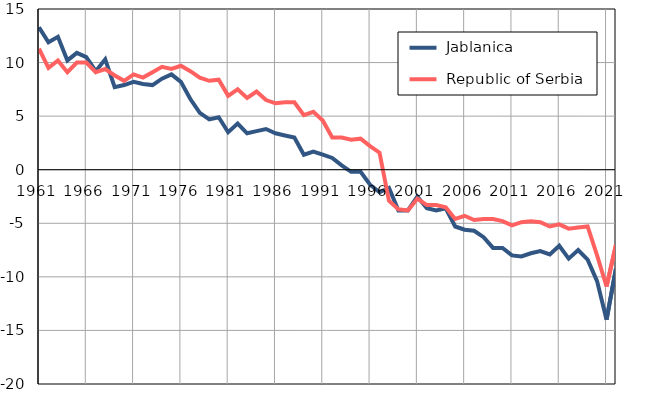
| Category |  Jablanica |  Republic of Serbia |
|---|---|---|
| 1961.0 | 13.3 | 11.3 |
| 1962.0 | 11.9 | 9.5 |
| 1963.0 | 12.4 | 10.2 |
| 1964.0 | 10.2 | 9.1 |
| 1965.0 | 10.9 | 10 |
| 1966.0 | 10.5 | 10 |
| 1967.0 | 9.2 | 9.1 |
| 1968.0 | 10.3 | 9.4 |
| 1969.0 | 7.7 | 8.8 |
| 1970.0 | 7.9 | 8.3 |
| 1971.0 | 8.2 | 8.9 |
| 1972.0 | 8 | 8.6 |
| 1973.0 | 7.9 | 9.1 |
| 1974.0 | 8.5 | 9.6 |
| 1975.0 | 8.9 | 9.4 |
| 1976.0 | 8.2 | 9.7 |
| 1977.0 | 6.6 | 9.2 |
| 1978.0 | 5.3 | 8.6 |
| 1979.0 | 4.7 | 8.3 |
| 1980.0 | 4.9 | 8.4 |
| 1981.0 | 3.5 | 6.9 |
| 1982.0 | 4.3 | 7.5 |
| 1983.0 | 3.4 | 6.7 |
| 1984.0 | 3.6 | 7.3 |
| 1985.0 | 3.8 | 6.5 |
| 1986.0 | 3.4 | 6.2 |
| 1987.0 | 3.2 | 6.3 |
| 1988.0 | 3 | 6.3 |
| 1989.0 | 1.4 | 5.1 |
| 1990.0 | 1.7 | 5.4 |
| 1991.0 | 1.4 | 4.6 |
| 1992.0 | 1.1 | 3 |
| 1993.0 | 0.4 | 3 |
| 1994.0 | -0.2 | 2.8 |
| 1995.0 | -0.2 | 2.9 |
| 1996.0 | -1.4 | 2.2 |
| 1997.0 | -2.1 | 1.6 |
| 1998.0 | -1.7 | -2.9 |
| 1999.0 | -3.8 | -3.7 |
| 2000.0 | -3.8 | -3.8 |
| 2001.0 | -2.5 | -2.7 |
| 2002.0 | -3.6 | -3.3 |
| 2003.0 | -3.8 | -3.3 |
| 2004.0 | -3.6 | -3.5 |
| 2005.0 | -5.3 | -4.6 |
| 2006.0 | -5.6 | -4.3 |
| 2007.0 | -5.7 | -4.7 |
| 2008.0 | -6.3 | -4.6 |
| 2009.0 | -7.3 | -4.6 |
| 2010.0 | -7.3 | -4.8 |
| 2011.0 | -8 | -5.2 |
| 2012.0 | -8.1 | -4.9 |
| 2013.0 | -7.8 | -4.8 |
| 2014.0 | -7.6 | -4.9 |
| 2015.0 | -7.9 | -5.3 |
| 2016.0 | -7.1 | -5.1 |
| 2017.0 | -8.3 | -5.5 |
| 2018.0 | -7.5 | -5.4 |
| 2019.0 | -8.4 | -5.3 |
| 2020.0 | -10.4 | -8 |
| 2021.0 | -14 | -10.9 |
| 2022.0 | -9.2 | -7 |